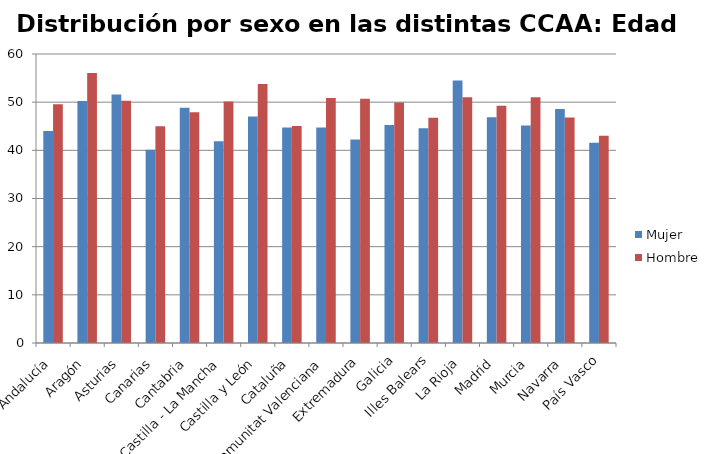
| Category | Mujer | Hombre |
|---|---|---|
| Andalucía | 44.03 | 49.59 |
| Aragón | 50.24 | 56.08 |
| Asturias | 51.57 | 50.32 |
| Canarias | 40.13 | 44.98 |
| Cantabria | 48.83 | 47.9 |
| Castilla - La Mancha | 41.91 | 50.13 |
| Castilla y León | 47.03 | 53.76 |
| Cataluña | 44.75 | 45.07 |
| Comunitat Valenciana | 44.74 | 50.88 |
| Extremadura | 42.26 | 50.7 |
| Galicia | 45.28 | 49.94 |
| Illes Balears | 44.58 | 46.77 |
| La Rioja | 54.5 | 51 |
| Madrid | 46.85 | 49.24 |
| Murcia | 45.14 | 51 |
| Navarra | 48.6 | 46.83 |
| País Vasco | 41.58 | 43.04 |